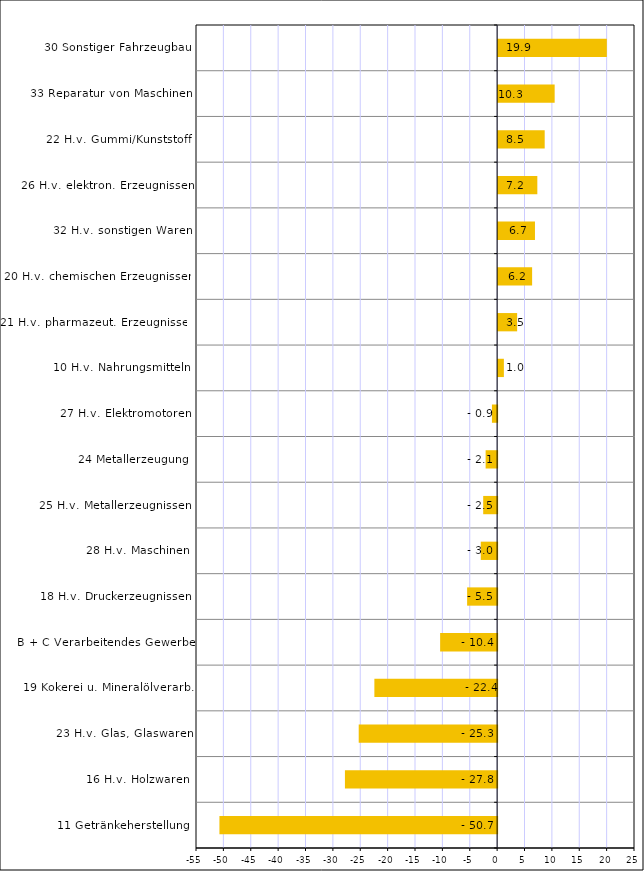
| Category | Series 0 |
|---|---|
| 11 Getränkeherstellung | -50.721 |
| 16 H.v. Holzwaren | -27.798 |
| 23 H.v. Glas, Glaswaren | -25.281 |
| 19 Kokerei u. Mineralölverarb. | -22.42 |
| B + C Verarbeitendes Gewerbe | -10.409 |
| 18 H.v. Druckerzeugnissen | -5.48 |
| 28 H.v. Maschinen | -2.99 |
| 25 H.v. Metallerzeugnissen | -2.544 |
| 24 Metallerzeugung | -2.1 |
| 27 H.v. Elektromotoren | -0.95 |
| 10 H.v. Nahrungsmitteln | 1.049 |
| 21 H.v. pharmazeut. Erzeugnissen | 3.473 |
| 20 H.v. chemischen Erzeugnissen | 6.208 |
| 32 H.v. sonstigen Waren | 6.73 |
| 26 H.v. elektron. Erzeugnissen | 7.161 |
| 22 H.v. Gummi/Kunststoff | 8.505 |
| 33 Reparatur von Maschinen | 10.326 |
| 30 Sonstiger Fahrzeugbau | 19.857 |